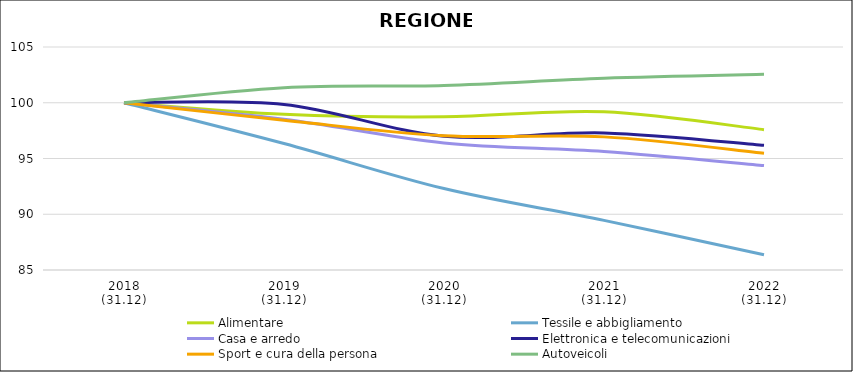
| Category | Alimentare | Tessile e abbigliamento | Casa e arredo | Elettronica e telecomunicazioni | Sport e cura della persona | Autoveicoli |
|---|---|---|---|---|---|---|
| 2018
(31.12) | 100 | 100 | 100 | 100 | 100 | 100 |
| 2019
(31.12) | 98.964 | 96.342 | 98.517 | 99.852 | 98.435 | 101.353 |
| 2020
(31.12) | 98.744 | 92.302 | 96.397 | 96.999 | 97.042 | 101.554 |
| 2021
(31.12) | 99.189 | 89.449 | 95.624 | 97.295 | 96.939 | 102.204 |
| 2022
(31.12) | 97.588 | 86.372 | 94.362 | 96.178 | 95.462 | 102.552 |